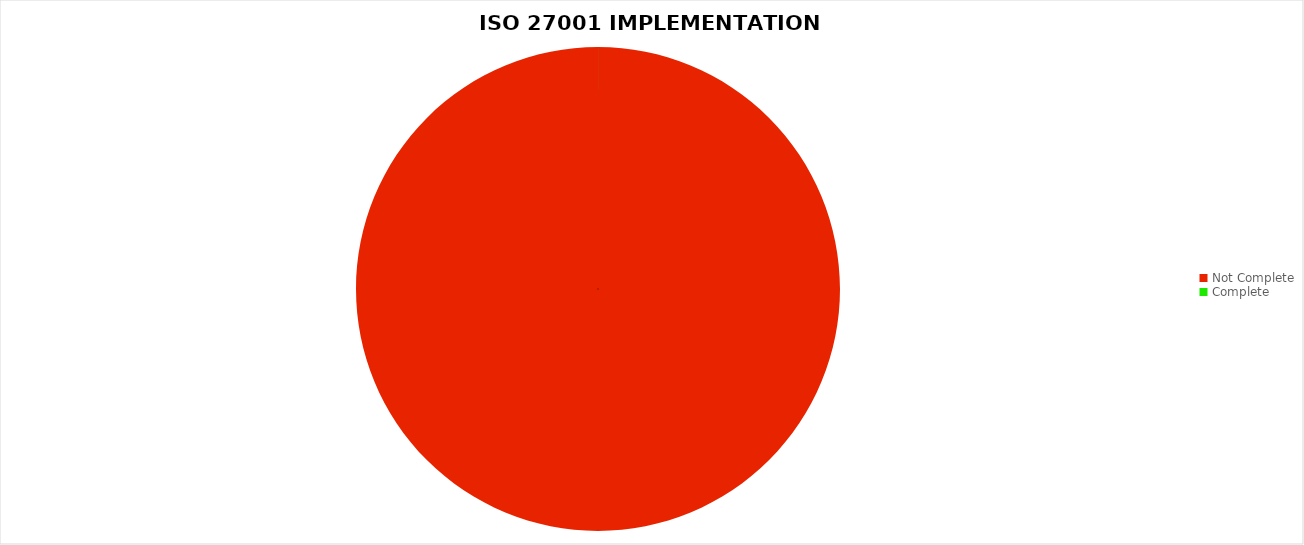
| Category | Series 0 |
|---|---|
| Not Complete | 73 |
| Complete | 0 |